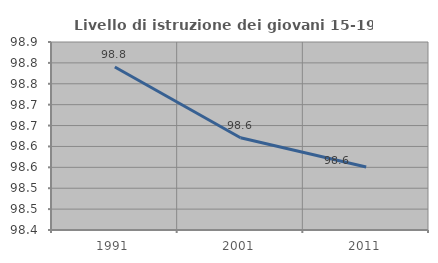
| Category | Livello di istruzione dei giovani 15-19 anni |
|---|---|
| 1991.0 | 98.79 |
| 2001.0 | 98.621 |
| 2011.0 | 98.551 |